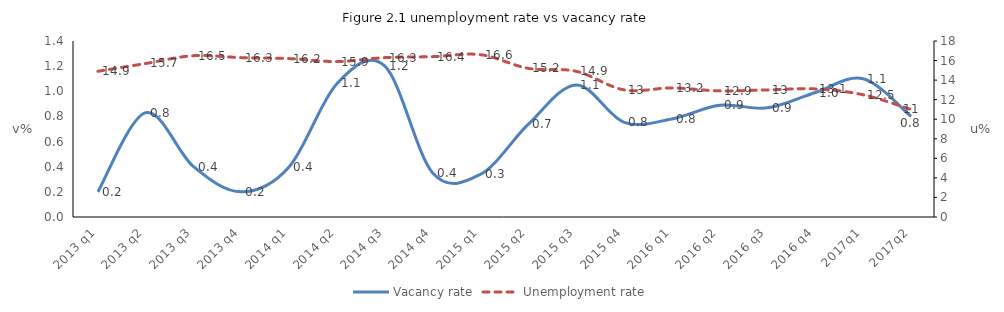
| Category | Vacancy rate |
|---|---|
| 2013 q1 | 0.2 |
| 2013 q2 | 0.83 |
| 2013 q3 | 0.4 |
| 2013 q4 | 0.2 |
| 2014 q1 | 0.4 |
| 2014 q2 | 1.062 |
| 2014 q3 | 1.2 |
| 2014 q4 | 0.35 |
| 2015 q1 | 0.34 |
| 2015 q2 | 0.738 |
| 2015 q3 | 1.051 |
| 2015 q4 | 0.753 |
| 2016 q1 | 0.78 |
| 2016 q2 | 0.889 |
| 2016 q3 | 0.868 |
| 2016 q4 | 0.99 |
| 2017q1 | 1.1 |
| 2017q2 | 0.8 |